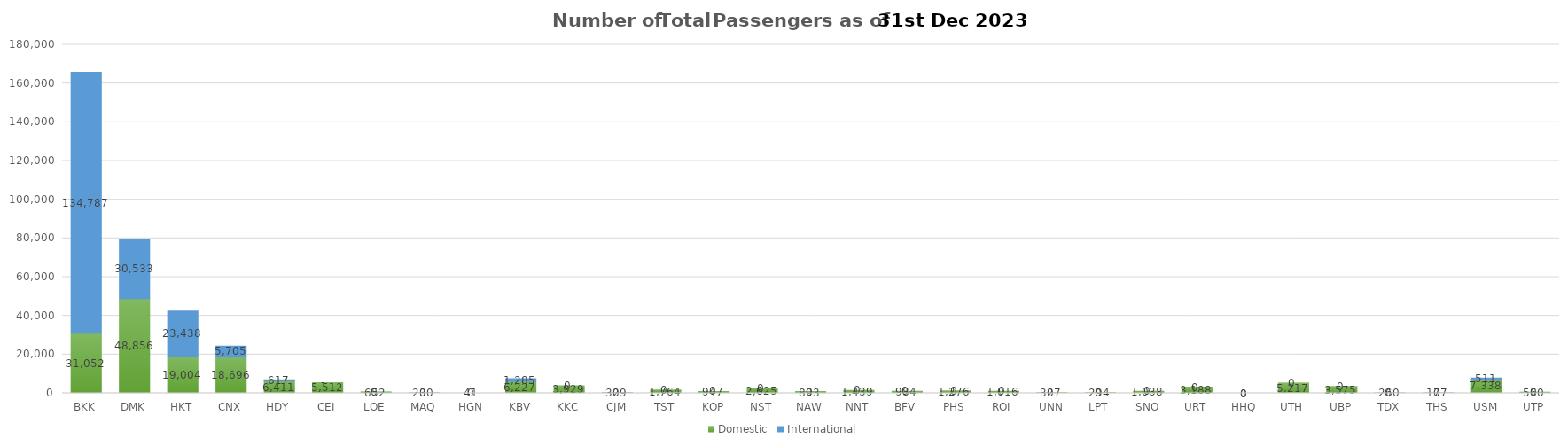
| Category | Domestic | International |
|---|---|---|
| BKK | 31052 | 134787 |
| DMK | 48856 | 30533 |
| HKT | 19004 | 23438 |
| CNX | 18696 | 5705 |
| HDY | 6411 | 617 |
| CEI | 5512 | 0 |
| LOE | 652 | 0 |
| MAQ | 230 | 0 |
| HGN | 41 | 0 |
| KBV | 6227 | 1285 |
| KKC | 3929 | 0 |
| CJM | 329 | 0 |
| TST | 1764 | 0 |
| KOP | 947 | 0 |
| NST | 2625 | 0 |
| NAW | 893 | 0 |
| NNT | 1439 | 0 |
| BFV | 984 | 0 |
| PHS | 1276 | 0 |
| ROI | 1016 | 0 |
| UNN | 327 | 0 |
| LPT | 294 | 0 |
| SNO | 1038 | 0 |
| URT | 3188 | 0 |
| HHQ | 0 | 0 |
| UTH | 5217 | 0 |
| UBP | 3575 | 0 |
| TDX | 260 | 0 |
| THS | 177 | 0 |
| USM | 7338 | 511 |
| UTP | 560 | 0 |